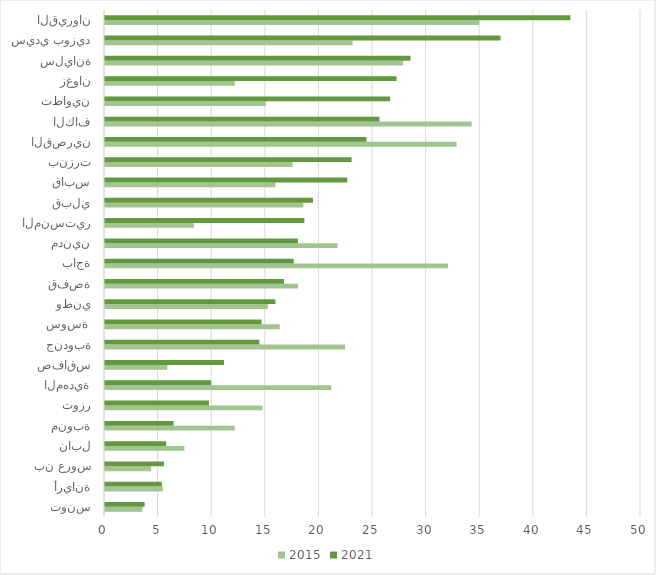
| Category | 2015 | 2021 |
|---|---|---|
| تونس | 3.5 | 3.7 |
| أريانة | 5.4 | 5.3 |
| بن عروس | 4.3 | 5.5 |
| نابل | 7.4 | 5.7 |
| منوبة | 12.1 | 6.4 |
| توزر | 14.7 | 9.7 |
| المهدية | 21.1 | 9.9 |
| صفاقس | 5.8 | 11.1 |
| جندوبة | 22.4 | 14.4 |
| سوسة  | 16.3 | 14.6 |
| وطني | 15.2 | 15.9 |
| قفصة | 18 | 16.7 |
| باجة | 32 | 17.6 |
| مدنين | 21.7 | 18 |
| المنستير | 8.3 | 18.6 |
| قبلي | 18.5 | 19.4 |
| قابس | 15.9 | 22.6 |
| بنزرت | 17.5 | 23 |
| القصرين | 32.8 | 24.4 |
| الكاف | 34.2 | 25.6 |
| تطاوين | 15 | 26.6 |
| زغوان | 12.1 | 27.2 |
| سليانة | 27.8 | 28.5 |
| سيدي بوزيد | 23.1 | 36.9 |
| القيروان | 34.9 | 43.4 |